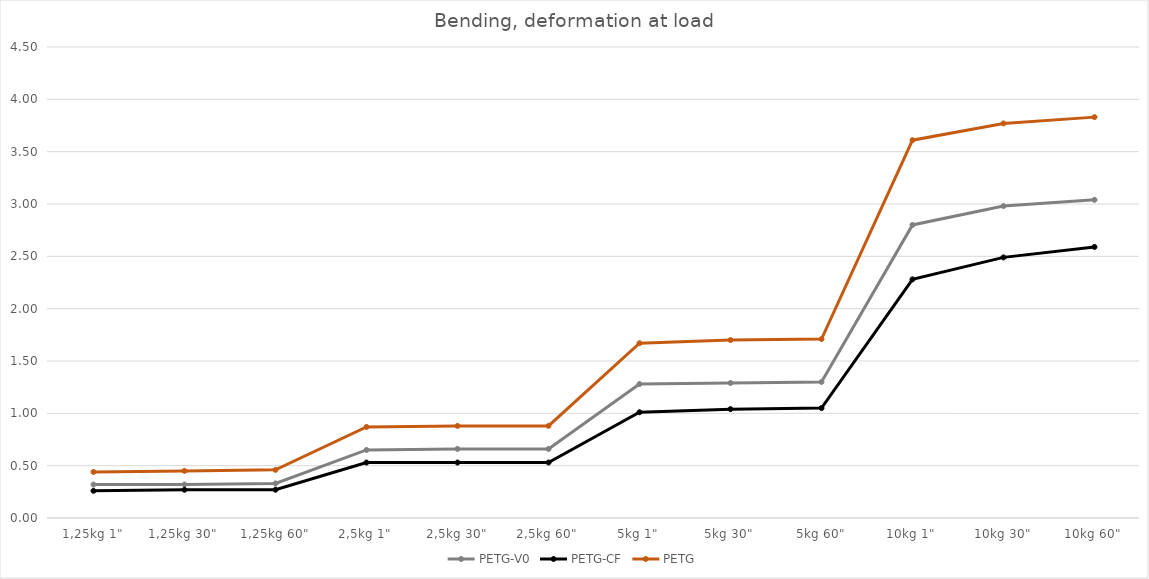
| Category | PETG-V0 | PETG-CF | PETG |
|---|---|---|---|
| 1,25kg 1" | 0.32 | 0.26 | 0.44 |
| 1,25kg 30" | 0.32 | 0.27 | 0.45 |
| 1,25kg 60" | 0.33 | 0.27 | 0.46 |
| 2,5kg 1" | 0.65 | 0.53 | 0.87 |
| 2,5kg 30" | 0.66 | 0.53 | 0.88 |
| 2,5kg 60" | 0.66 | 0.53 | 0.88 |
| 5kg 1" | 1.28 | 1.01 | 1.67 |
| 5kg 30" | 1.29 | 1.04 | 1.7 |
| 5kg 60" | 1.3 | 1.05 | 1.71 |
| 10kg 1" | 2.8 | 2.28 | 3.61 |
| 10kg 30" | 2.98 | 2.49 | 3.77 |
| 10kg 60" | 3.04 | 2.59 | 3.83 |